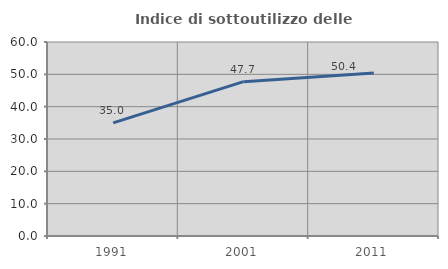
| Category | Indice di sottoutilizzo delle abitazioni  |
|---|---|
| 1991.0 | 34.996 |
| 2001.0 | 47.735 |
| 2011.0 | 50.392 |